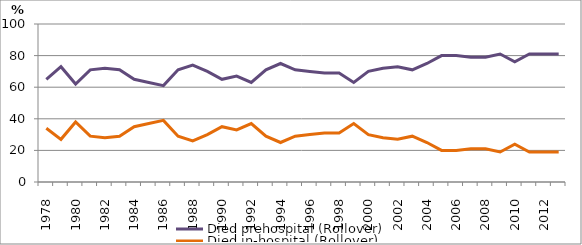
| Category | Died prehospital (Rollover) | Died in-hospital (Rollover) |
|---|---|---|
| 1978.0 | 65 | 34 |
| 1979.0 | 73 | 27 |
| 1980.0 | 62 | 38 |
| 1981.0 | 71 | 29 |
| 1982.0 | 72 | 28 |
| 1983.0 | 71 | 29 |
| 1984.0 | 65 | 35 |
| 1985.0 | 63 | 37 |
| 1986.0 | 61 | 39 |
| 1987.0 | 71 | 29 |
| 1988.0 | 74 | 26 |
| 1989.0 | 70 | 30 |
| 1990.0 | 65 | 35 |
| 1991.0 | 67 | 33 |
| 1992.0 | 63 | 37 |
| 1993.0 | 71 | 29 |
| 1994.0 | 75 | 25 |
| 1995.0 | 71 | 29 |
| 1996.0 | 70 | 30 |
| 1997.0 | 69 | 31 |
| 1998.0 | 69 | 31 |
| 1999.0 | 63 | 37 |
| 2000.0 | 70 | 30 |
| 2001.0 | 72 | 28 |
| 2002.0 | 73 | 27 |
| 2003.0 | 71 | 29 |
| 2004.0 | 75 | 25 |
| 2005.0 | 80 | 20 |
| 2006.0 | 80 | 20 |
| 2007.0 | 79 | 21 |
| 2008.0 | 79 | 21 |
| 2009.0 | 81 | 19 |
| 2010.0 | 76 | 24 |
| 2011.0 | 81 | 19 |
| 2012.0 | 81 | 19 |
| 2013.0 | 81 | 19 |